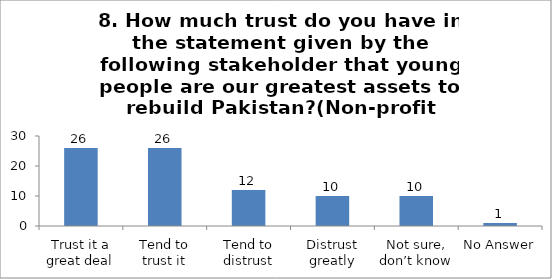
| Category | 8. How much trust do you have in the statement given by the following stakeholder that young people are our greatest assets to rebuild Pakistan?(Non-profit institutions) |
|---|---|
| Trust it a great deal | 26 |
| Tend to trust it | 26 |
| Tend to distrust | 12 |
| Distrust greatly | 10 |
| Not sure, don’t know | 10 |
| No Answer | 1 |